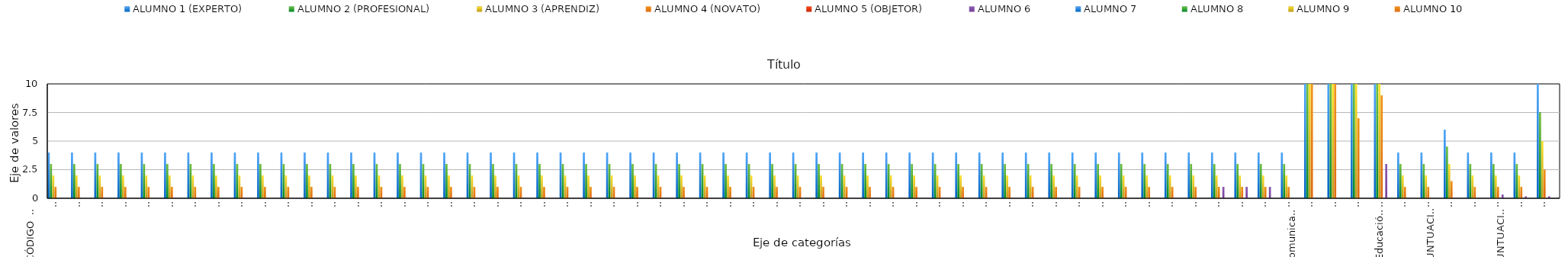
| Category | ALUMNO 1 (EXPERTO) | ALUMNO 2 (PROFESIONAL) | ALUMNO 3 (APRENDIZ) | ALUMNO 4 (NOVATO) | ALUMNO 5 (OBJETOR) | ALUMNO 6 | ALUMNO 7 | ALUMNO 8 | ALUMNO 9 | ALUMNO 10 |
|---|---|---|---|---|---|---|---|---|---|---|
| 0 | 4 | 3 | 2 | 1 | 0 | 0 | 0 | 0 | 0 | 0 |
| 1 | 4 | 3 | 2 | 1 | 0 | 0 | 0 | 0 | 0 | 0 |
| 2 | 4 | 3 | 2 | 1 | 0 | 0 | 0 | 0 | 0 | 0 |
| 3 | 4 | 3 | 2 | 1 | 0 | 0 | 0 | 0 | 0 | 0 |
| 4 | 4 | 3 | 2 | 1 | 0 | 0 | 0 | 0 | 0 | 0 |
| 5 | 4 | 3 | 2 | 1 | 0 | 0 | 0 | 0 | 0 | 0 |
| 6 | 4 | 3 | 2 | 1 | 0 | 0 | 0 | 0 | 0 | 0 |
| 7 | 4 | 3 | 2 | 1 | 0 | 0 | 0 | 0 | 0 | 0 |
| 8 | 4 | 3 | 2 | 1 | 0 | 0 | 0 | 0 | 0 | 0 |
| 9 | 4 | 3 | 2 | 1 | 0 | 0 | 0 | 0 | 0 | 0 |
| 10 | 4 | 3 | 2 | 1 | 0 | 0 | 0 | 0 | 0 | 0 |
| 11 | 4 | 3 | 2 | 1 | 0 | 0 | 0 | 0 | 0 | 0 |
| 12 | 4 | 3 | 2 | 1 | 0 | 0 | 0 | 0 | 0 | 0 |
| 13 | 4 | 3 | 2 | 1 | 0 | 0 | 0 | 0 | 0 | 0 |
| 14 | 4 | 3 | 2 | 1 | 0 | 0 | 0 | 0 | 0 | 0 |
| 15 | 4 | 3 | 2 | 1 | 0 | 0 | 0 | 0 | 0 | 0 |
| 16 | 4 | 3 | 2 | 1 | 0 | 0 | 0 | 0 | 0 | 0 |
| 17 | 4 | 3 | 2 | 1 | 0 | 0 | 0 | 0 | 0 | 0 |
| 18 | 4 | 3 | 2 | 1 | 0 | 0 | 0 | 0 | 0 | 0 |
| 19 | 4 | 3 | 2 | 1 | 0 | 0 | 0 | 0 | 0 | 0 |
| 20 | 4 | 3 | 2 | 1 | 0 | 0 | 0 | 0 | 0 | 0 |
| 21 | 4 | 3 | 2 | 1 | 0 | 0 | 0 | 0 | 0 | 0 |
| 22 | 4 | 3 | 2 | 1 | 0 | 0 | 0 | 0 | 0 | 0 |
| 23 | 4 | 3 | 2 | 1 | 0 | 0 | 0 | 0 | 0 | 0 |
| 24 | 4 | 3 | 2 | 1 | 0 | 0 | 0 | 0 | 0 | 0 |
| 25 | 4 | 3 | 2 | 1 | 0 | 0 | 0 | 0 | 0 | 0 |
| 26 | 4 | 3 | 2 | 1 | 0 | 0 | 0 | 0 | 0 | 0 |
| 27 | 4 | 3 | 2 | 1 | 0 | 0 | 0 | 0 | 0 | 0 |
| 28 | 4 | 3 | 2 | 1 | 0 | 0 | 0 | 0 | 0 | 0 |
| 29 | 4 | 3 | 2 | 1 | 0 | 0 | 0 | 0 | 0 | 0 |
| 30 | 4 | 3 | 2 | 1 | 0 | 0 | 0 | 0 | 0 | 0 |
| 31 | 4 | 3 | 2 | 1 | 0 | 0 | 0 | 0 | 0 | 0 |
| 32 | 4 | 3 | 2 | 1 | 0 | 0 | 0 | 0 | 0 | 0 |
| 33 | 4 | 3 | 2 | 1 | 0 | 0 | 0 | 0 | 0 | 0 |
| 34 | 4 | 3 | 2 | 1 | 0 | 0 | 0 | 0 | 0 | 0 |
| 35 | 4 | 3 | 2 | 1 | 0 | 0 | 0 | 0 | 0 | 0 |
| 36 | 4 | 3 | 2 | 1 | 0 | 0 | 0 | 0 | 0 | 0 |
| 37 | 4 | 3 | 2 | 1 | 0 | 0 | 0 | 0 | 0 | 0 |
| 38 | 4 | 3 | 2 | 1 | 0 | 0 | 0 | 0 | 0 | 0 |
| 39 | 4 | 3 | 2 | 1 | 0 | 0 | 0 | 0 | 0 | 0 |
| 40 | 4 | 3 | 2 | 1 | 0 | 0 | 0 | 0 | 0 | 0 |
| 41 | 4 | 3 | 2 | 1 | 0 | 0 | 0 | 0 | 0 | 0 |
| 42 | 4 | 3 | 2 | 1 | 0 | 0 | 0 | 0 | 0 | 0 |
| 43 | 4 | 3 | 2 | 1 | 0 | 0 | 0 | 0 | 0 | 0 |
| 44 | 4 | 3 | 2 | 1 | 0 | 0 | 0 | 0 | 0 | 0 |
| 45 | 4 | 3 | 2 | 1 | 0 | 0 | 0 | 0 | 0 | 0 |
| 46 | 4 | 3 | 2 | 1 | 0 | 0 | 0 | 0 | 0 | 0 |
| 47 | 4 | 3 | 2 | 1 | 0 | 0 | 0 | 0 | 0 | 0 |
| 48 | 4 | 3 | 2 | 1 | 0 | 0 | 0 | 0 | 0 | 0 |
| 49 | 4 | 3 | 2 | 1 | 0 | 0 | 0 | 0 | 0 | 0 |
| 50 | 4 | 3 | 2 | 1 | 0 | 1 | 0 | 0 | 0 | 0 |
| 51 | 4 | 3 | 2 | 1 | 0 | 1 | 0 | 0 | 0 | 0 |
| 52 | 4 | 3 | 2 | 1 | 0 | 1 | 0 | 0 | 0 | 0 |
| 53 | 4 | 3 | 2 | 1 | 0 | 0 | 0 | 0 | 0 | 0 |
| 54 | 60 | 45 | 30 | 15 | 0 | 0 | 0 | 0 | 0 | 0 |
| 55 | 92 | 69 | 46 | 23 | 0 | 0 | 0 | 0 | 0 | 0 |
| 56 | 28 | 21 | 14 | 7 | 0 | 0 | 0 | 0 | 0 | 0 |
| 57 | 36 | 27 | 18 | 9 | 0 | 3 | 0 | 0 | 0 | 0 |
| 58 | 4 | 3 | 2 | 1 | 0 | 0 | 0 | 0 | 0 | 0 |
| 59 | 4 | 3 | 2 | 1 | 0 | 0 | 0 | 0 | 0 | 0 |
| 60 | 6 | 4.5 | 3 | 1.5 | 0 | 0 | 0 | 0 | 0 | 0 |
| 61 | 4 | 3 | 2 | 1 | 0 | 0 | 0 | 0 | 0 | 0 |
| 62 | 4 | 3 | 2 | 1 | 0 | 0.333 | 0 | 0 | 0 | 0 |
| 63 | 4 | 3 | 2 | 1 | 0 | 0.167 | 0 | 0 | 0 | 0 |
| 64 | 10 | 7.5 | 5 | 2.5 | 0 | 0.167 | 0 | 0 | 0 | 0 |